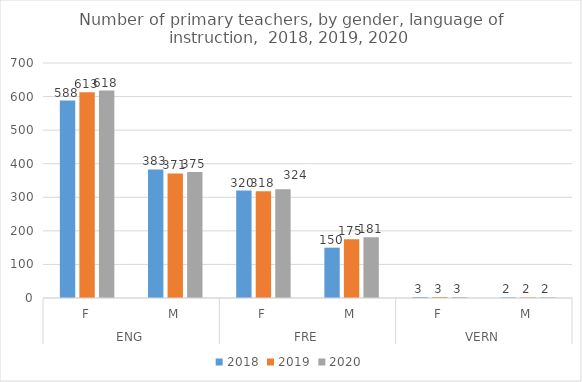
| Category | 2018 | 2019 | 2020 |
|---|---|---|---|
| 0 | 588 | 613 | 618 |
| 1 | 383 | 371 | 375 |
| 2 | 320 | 318 | 324 |
| 3 | 150 | 175 | 181 |
| 4 | 3 | 3 | 3 |
| 5 | 2 | 2 | 2 |